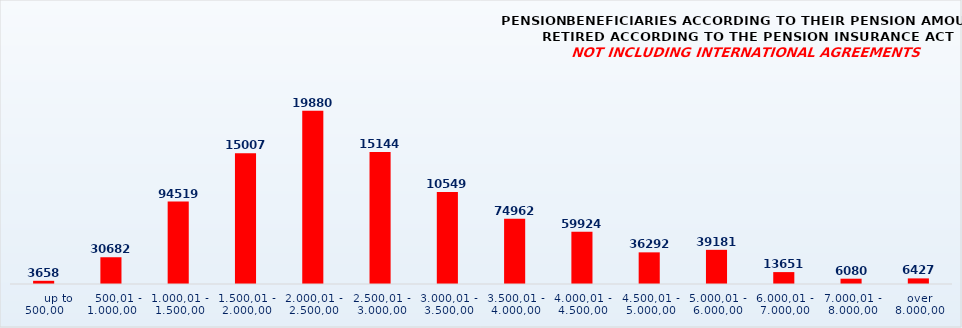
| Category | PENSION BENEFICIARIES ACCORDING TO TYPES AND AMOUNTS OF PENSION, RETIRED ACCORDING TO THE PENSION INSURANCE ACT
NOT INCLUDING INTERNATIONAL AGREEMENTS |
|---|---|
|       up to 500,00 | 3658 |
|    500,01 - 1.000,00 | 30682 |
| 1.000,01 - 1.500,00 | 94519 |
| 1.500,01 - 2.000,00 | 150072 |
| 2.000,01 - 2.500,00 | 198805 |
| 2.500,01 - 3.000,00 | 151440 |
| 3.000,01 - 3.500,00 | 105490 |
| 3.500,01 - 4.000,00 | 74962 |
| 4.000,01 - 4.500,00 | 59924 |
| 4.500,01 - 5.000,00 | 36292 |
| 5.000,01 - 6.000,00 | 39181 |
| 6.000,01 - 7.000,00 | 13651 |
| 7.000,01 - 8.000,00 | 6080 |
|  over  8.000,00 | 6427 |